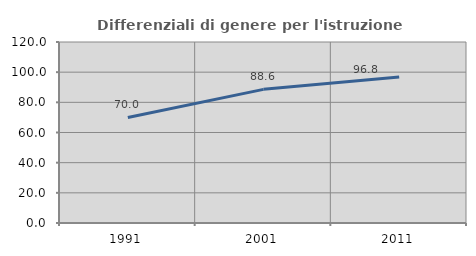
| Category | Differenziali di genere per l'istruzione superiore |
|---|---|
| 1991.0 | 70 |
| 2001.0 | 88.596 |
| 2011.0 | 96.829 |